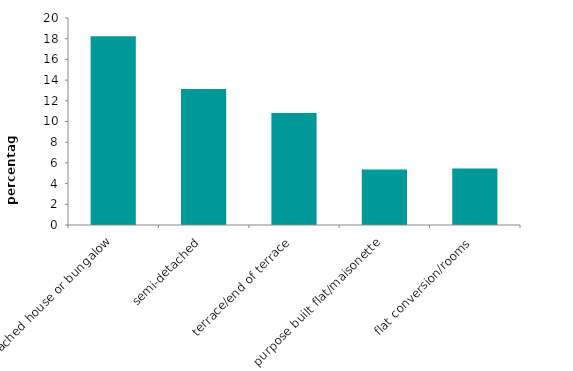
| Category | Series 0 |
|---|---|
| detached house or bungalow | 18.226 |
| semi-detached | 13.143 |
| terrace/end of terrace | 10.817 |
| purpose built flat/maisonette | 5.356 |
| flat conversion/rooms | 5.465 |